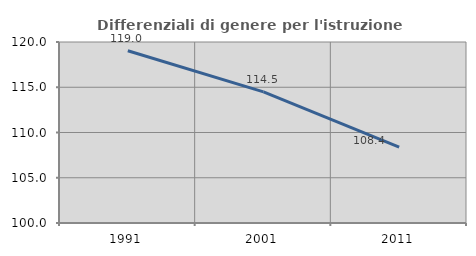
| Category | Differenziali di genere per l'istruzione superiore |
|---|---|
| 1991.0 | 119.033 |
| 2001.0 | 114.489 |
| 2011.0 | 108.394 |